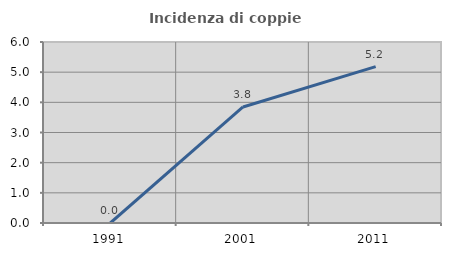
| Category | Incidenza di coppie miste |
|---|---|
| 1991.0 | 0 |
| 2001.0 | 3.846 |
| 2011.0 | 5.185 |